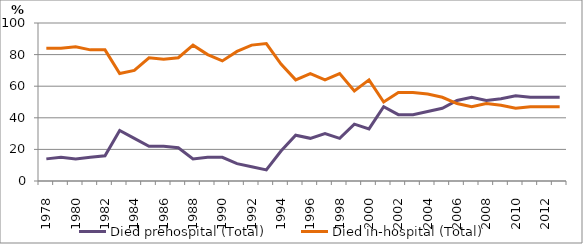
| Category | Died prehospital (Total) | Died in-hospital (Total) |
|---|---|---|
| 1978.0 | 14 | 84 |
| 1979.0 | 15 | 84 |
| 1980.0 | 14 | 85 |
| 1981.0 | 15 | 83 |
| 1982.0 | 16 | 83 |
| 1983.0 | 32 | 68 |
| 1984.0 | 27 | 70 |
| 1985.0 | 22 | 78 |
| 1986.0 | 22 | 77 |
| 1987.0 | 21 | 78 |
| 1988.0 | 14 | 86 |
| 1989.0 | 15 | 80 |
| 1990.0 | 15 | 76 |
| 1991.0 | 11 | 82 |
| 1992.0 | 9 | 86 |
| 1993.0 | 7 | 87 |
| 1994.0 | 19 | 74 |
| 1995.0 | 29 | 64 |
| 1996.0 | 27 | 68 |
| 1997.0 | 30 | 64 |
| 1998.0 | 27 | 68 |
| 1999.0 | 36 | 57 |
| 2000.0 | 33 | 64 |
| 2001.0 | 47 | 50 |
| 2002.0 | 42 | 56 |
| 2003.0 | 42 | 56 |
| 2004.0 | 44 | 55 |
| 2005.0 | 46 | 53 |
| 2006.0 | 51 | 49 |
| 2007.0 | 53 | 47 |
| 2008.0 | 51 | 49 |
| 2009.0 | 52 | 48 |
| 2010.0 | 54 | 46 |
| 2011.0 | 53 | 47 |
| 2012.0 | 53 | 47 |
| 2013.0 | 53 | 47 |